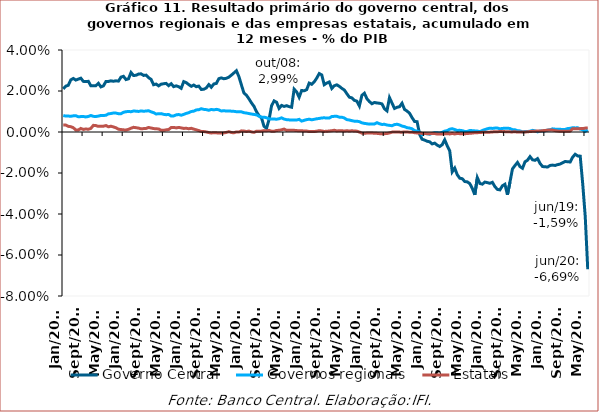
| Category | Governo Central | Governos regionais | Estatais |
|---|---|---|---|
| 2003-01-01 | 0.021 | 0.008 | 0.003 |
| 2003-02-01 | 0.022 | 0.008 | 0.003 |
| 2003-03-01 | 0.023 | 0.008 | 0.003 |
| 2003-04-01 | 0.025 | 0.008 | 0.003 |
| 2003-05-01 | 0.026 | 0.008 | 0.002 |
| 2003-06-01 | 0.025 | 0.008 | 0.001 |
| 2003-07-01 | 0.026 | 0.007 | 0.001 |
| 2003-08-01 | 0.026 | 0.008 | 0.002 |
| 2003-09-01 | 0.025 | 0.008 | 0.001 |
| 2003-10-01 | 0.025 | 0.007 | 0.001 |
| 2003-11-01 | 0.025 | 0.008 | 0.001 |
| 2003-12-01 | 0.023 | 0.008 | 0.002 |
| 2004-01-01 | 0.023 | 0.008 | 0.003 |
| 2004-02-01 | 0.023 | 0.008 | 0.003 |
| 2004-03-01 | 0.024 | 0.008 | 0.003 |
| 2004-04-01 | 0.022 | 0.008 | 0.003 |
| 2004-05-01 | 0.023 | 0.008 | 0.003 |
| 2004-06-01 | 0.025 | 0.008 | 0.003 |
| 2004-07-01 | 0.025 | 0.009 | 0.003 |
| 2004-08-01 | 0.025 | 0.009 | 0.003 |
| 2004-09-01 | 0.025 | 0.009 | 0.002 |
| 2004-10-01 | 0.025 | 0.009 | 0.002 |
| 2004-11-01 | 0.025 | 0.009 | 0.001 |
| 2004-12-01 | 0.027 | 0.009 | 0.001 |
| 2005-01-01 | 0.027 | 0.01 | 0.001 |
| 2005-02-01 | 0.026 | 0.01 | 0.001 |
| 2005-03-01 | 0.026 | 0.01 | 0.001 |
| 2005-04-01 | 0.029 | 0.01 | 0.002 |
| 2005-05-01 | 0.028 | 0.01 | 0.002 |
| 2005-06-01 | 0.028 | 0.01 | 0.002 |
| 2005-07-01 | 0.028 | 0.01 | 0.002 |
| 2005-08-01 | 0.028 | 0.01 | 0.002 |
| 2005-09-01 | 0.028 | 0.01 | 0.002 |
| 2005-10-01 | 0.028 | 0.01 | 0.002 |
| 2005-11-01 | 0.027 | 0.01 | 0.002 |
| 2005-12-01 | 0.026 | 0.01 | 0.002 |
| 2006-01-01 | 0.023 | 0.009 | 0.002 |
| 2006-02-01 | 0.023 | 0.009 | 0.002 |
| 2006-03-01 | 0.023 | 0.009 | 0.002 |
| 2006-04-01 | 0.023 | 0.009 | 0.001 |
| 2006-05-01 | 0.024 | 0.009 | 0.001 |
| 2006-06-01 | 0.024 | 0.008 | 0.001 |
| 2006-07-01 | 0.023 | 0.009 | 0.001 |
| 2006-08-01 | 0.024 | 0.008 | 0.002 |
| 2006-09-01 | 0.022 | 0.008 | 0.002 |
| 2006-10-01 | 0.023 | 0.008 | 0.002 |
| 2006-11-01 | 0.022 | 0.009 | 0.002 |
| 2006-12-01 | 0.021 | 0.008 | 0.002 |
| 2007-01-01 | 0.025 | 0.009 | 0.002 |
| 2007-02-01 | 0.024 | 0.009 | 0.002 |
| 2007-03-01 | 0.023 | 0.009 | 0.002 |
| 2007-04-01 | 0.022 | 0.01 | 0.002 |
| 2007-05-01 | 0.023 | 0.01 | 0.001 |
| 2007-06-01 | 0.022 | 0.011 | 0.001 |
| 2007-07-01 | 0.022 | 0.011 | 0.001 |
| 2007-08-01 | 0.021 | 0.011 | 0 |
| 2007-09-01 | 0.021 | 0.011 | 0 |
| 2007-10-01 | 0.021 | 0.011 | 0 |
| 2007-11-01 | 0.023 | 0.011 | 0 |
| 2007-12-01 | 0.022 | 0.011 | 0 |
| 2008-01-01 | 0.023 | 0.011 | 0 |
| 2008-02-01 | 0.024 | 0.011 | 0 |
| 2008-03-01 | 0.026 | 0.011 | -0.001 |
| 2008-04-01 | 0.026 | 0.01 | -0.001 |
| 2008-05-01 | 0.026 | 0.01 | 0 |
| 2008-06-01 | 0.026 | 0.01 | 0 |
| 2008-07-01 | 0.027 | 0.01 | 0 |
| 2008-08-01 | 0.028 | 0.01 | 0 |
| 2008-09-01 | 0.029 | 0.01 | 0 |
| 2008-10-01 | 0.03 | 0.01 | 0 |
| 2008-11-01 | 0.027 | 0.01 | 0 |
| 2008-12-01 | 0.023 | 0.01 | 0.001 |
| 2009-01-01 | 0.019 | 0.009 | 0 |
| 2009-02-01 | 0.018 | 0.009 | 0 |
| 2009-03-01 | 0.016 | 0.009 | 0 |
| 2009-04-01 | 0.014 | 0.009 | 0 |
| 2009-05-01 | 0.013 | 0.009 | 0 |
| 2009-06-01 | 0.01 | 0.008 | 0 |
| 2009-07-01 | 0.008 | 0.008 | 0 |
| 2009-08-01 | 0.007 | 0.007 | 0 |
| 2009-09-01 | 0.003 | 0.007 | 0.001 |
| 2009-10-01 | 0.002 | 0.007 | 0.001 |
| 2009-11-01 | 0.006 | 0.006 | 0.001 |
| 2009-12-01 | 0.013 | 0.006 | 0 |
| 2010-01-01 | 0.015 | 0.006 | 0 |
| 2010-02-01 | 0.015 | 0.006 | 0.001 |
| 2010-03-01 | 0.012 | 0.006 | 0.001 |
| 2010-04-01 | 0.013 | 0.007 | 0.001 |
| 2010-05-01 | 0.012 | 0.006 | 0.001 |
| 2010-06-01 | 0.013 | 0.006 | 0.001 |
| 2010-07-01 | 0.012 | 0.006 | 0.001 |
| 2010-08-01 | 0.012 | 0.006 | 0.001 |
| 2010-09-01 | 0.021 | 0.006 | 0.001 |
| 2010-10-01 | 0.02 | 0.006 | 0.001 |
| 2010-11-01 | 0.017 | 0.006 | 0.001 |
| 2010-12-01 | 0.02 | 0.005 | 0.001 |
| 2011-01-01 | 0.02 | 0.006 | 0 |
| 2011-02-01 | 0.021 | 0.006 | 0 |
| 2011-03-01 | 0.024 | 0.006 | 0 |
| 2011-04-01 | 0.023 | 0.006 | 0 |
| 2011-05-01 | 0.024 | 0.006 | 0 |
| 2011-06-01 | 0.026 | 0.006 | 0 |
| 2011-07-01 | 0.028 | 0.007 | 0.001 |
| 2011-08-01 | 0.028 | 0.007 | 0.001 |
| 2011-09-01 | 0.023 | 0.007 | 0 |
| 2011-10-01 | 0.024 | 0.007 | 0 |
| 2011-11-01 | 0.024 | 0.007 | 0 |
| 2011-12-01 | 0.021 | 0.008 | 0.001 |
| 2012-01-01 | 0.023 | 0.008 | 0.001 |
| 2012-02-01 | 0.023 | 0.008 | 0.001 |
| 2012-03-01 | 0.022 | 0.007 | 0.001 |
| 2012-04-01 | 0.021 | 0.007 | 0.001 |
| 2012-05-01 | 0.02 | 0.007 | 0 |
| 2012-06-01 | 0.019 | 0.006 | 0.001 |
| 2012-07-01 | 0.017 | 0.006 | 0 |
| 2012-08-01 | 0.017 | 0.006 | 0.001 |
| 2012-09-01 | 0.015 | 0.005 | 0 |
| 2012-10-01 | 0.015 | 0.005 | 0 |
| 2012-11-01 | 0.013 | 0.005 | 0 |
| 2012-12-01 | 0.018 | 0.004 | -0.001 |
| 2013-01-01 | 0.019 | 0.004 | -0.001 |
| 2013-02-01 | 0.016 | 0.004 | -0.001 |
| 2013-03-01 | 0.015 | 0.004 | 0 |
| 2013-04-01 | 0.014 | 0.004 | 0 |
| 2013-05-01 | 0.014 | 0.004 | -0.001 |
| 2013-06-01 | 0.014 | 0.005 | -0.001 |
| 2013-07-01 | 0.014 | 0.004 | -0.001 |
| 2013-08-01 | 0.014 | 0.004 | -0.001 |
| 2013-09-01 | 0.011 | 0.004 | -0.001 |
| 2013-10-01 | 0.01 | 0.003 | -0.001 |
| 2013-11-01 | 0.017 | 0.003 | 0 |
| 2013-12-01 | 0.014 | 0.003 | 0 |
| 2014-01-01 | 0.011 | 0.004 | 0 |
| 2014-02-01 | 0.012 | 0.004 | 0 |
| 2014-03-01 | 0.012 | 0.003 | 0 |
| 2014-04-01 | 0.014 | 0.003 | 0 |
| 2014-05-01 | 0.011 | 0.003 | 0 |
| 2014-06-01 | 0.01 | 0.002 | 0 |
| 2014-07-01 | 0.009 | 0.002 | 0 |
| 2014-08-01 | 0.007 | 0.002 | 0 |
| 2014-09-01 | 0.005 | 0.001 | 0 |
| 2014-10-01 | 0.005 | 0 | 0 |
| 2014-11-01 | -0.001 | 0 | 0 |
| 2014-12-01 | -0.004 | -0.001 | -0.001 |
| 2015-01-01 | -0.004 | -0.001 | -0.001 |
| 2015-02-01 | -0.005 | -0.001 | -0.001 |
| 2015-03-01 | -0.005 | -0.001 | -0.001 |
| 2015-04-01 | -0.006 | -0.001 | -0.001 |
| 2015-05-01 | -0.005 | 0 | -0.001 |
| 2015-06-01 | -0.006 | 0 | -0.001 |
| 2015-07-01 | -0.007 | -0.001 | -0.001 |
| 2015-08-01 | -0.006 | 0 | -0.001 |
| 2015-09-01 | -0.004 | 0 | -0.001 |
| 2015-10-01 | -0.007 | 0.001 | -0.001 |
| 2015-11-01 | -0.009 | 0.001 | -0.001 |
| 2015-12-01 | -0.019 | 0.002 | -0.001 |
| 2016-01-01 | -0.018 | 0.001 | -0.001 |
| 2016-02-01 | -0.021 | 0.001 | -0.001 |
| 2016-03-01 | -0.023 | 0.001 | -0.001 |
| 2016-04-01 | -0.023 | 0.001 | -0.001 |
| 2016-05-01 | -0.024 | 0 | -0.001 |
| 2016-06-01 | -0.024 | 0 | -0.001 |
| 2016-07-01 | -0.025 | 0.001 | -0.001 |
| 2016-08-01 | -0.028 | 0.001 | -0.001 |
| 2016-09-01 | -0.031 | 0.001 | 0 |
| 2016-10-01 | -0.022 | 0 | 0 |
| 2016-11-01 | -0.025 | 0 | 0 |
| 2016-12-01 | -0.025 | 0.001 | 0 |
| 2017-01-01 | -0.024 | 0.001 | 0 |
| 2017-02-01 | -0.025 | 0.002 | 0 |
| 2017-03-01 | -0.025 | 0.002 | 0 |
| 2017-04-01 | -0.025 | 0.002 | 0 |
| 2017-05-01 | -0.027 | 0.002 | 0 |
| 2017-06-01 | -0.028 | 0.002 | 0 |
| 2017-07-01 | -0.028 | 0.002 | 0 |
| 2017-08-01 | -0.026 | 0.002 | 0 |
| 2017-09-01 | -0.025 | 0.002 | 0 |
| 2017-10-01 | -0.031 | 0.002 | 0 |
| 2017-11-01 | -0.024 | 0.002 | 0 |
| 2017-12-01 | -0.018 | 0.001 | 0 |
| 2018-01-01 | -0.016 | 0.001 | 0 |
| 2018-02-01 | -0.015 | 0.001 | 0 |
| 2018-03-01 | -0.017 | 0.001 | 0 |
| 2018-04-01 | -0.018 | 0 | 0 |
| 2018-05-01 | -0.015 | 0 | 0 |
| 2018-06-01 | -0.014 | 0 | 0 |
| 2018-07-01 | -0.012 | 0 | 0 |
| 2018-08-01 | -0.014 | 0.001 | 0 |
| 2018-09-01 | -0.014 | 0.001 | 0 |
| 2018-10-01 | -0.013 | 0 | 0.001 |
| 2018-11-01 | -0.015 | 0 | 0 |
| 2018-12-01 | -0.017 | 0.001 | 0.001 |
| 2019-01-01 | -0.017 | 0.001 | 0.001 |
| 2019-02-01 | -0.017 | 0.001 | 0.001 |
| 2019-03-01 | -0.016 | 0.001 | 0.001 |
| 2019-04-01 | -0.016 | 0.002 | 0.001 |
| 2019-05-01 | -0.016 | 0.001 | 0.001 |
| 2019-06-01 | -0.016 | 0.001 | 0 |
| 2019-07-01 | -0.016 | 0.001 | 0 |
| 2019-08-01 | -0.015 | 0.001 | 0 |
| 2019-09-01 | -0.014 | 0.001 | 0 |
| 2019-10-01 | -0.015 | 0.002 | 0 |
| 2019-11-01 | -0.015 | 0.002 | 0 |
| 2019-12-01 | -0.012 | 0.002 | 0.002 |
| 2020-01-01 | -0.011 | 0.002 | 0.002 |
| 2020-02-01 | -0.012 | 0.002 | 0.002 |
| 2020-03-01 | -0.012 | 0.001 | 0.002 |
| 2020-04-01 | -0.025 | 0.001 | 0.002 |
| 2020-05-01 | -0.041 | 0 | 0.002 |
| 2020-06-01 | -0.067 | 0.001 | 0.002 |